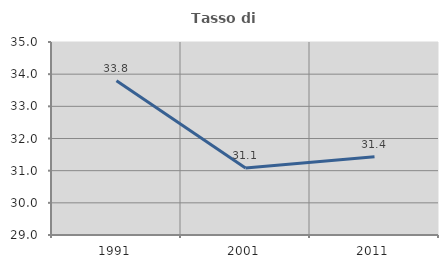
| Category | Tasso di occupazione   |
|---|---|
| 1991.0 | 33.796 |
| 2001.0 | 31.081 |
| 2011.0 | 31.433 |